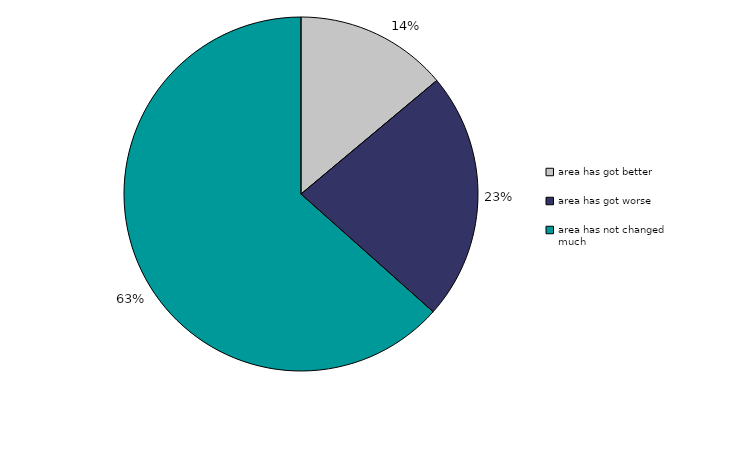
| Category | Series 0 |
|---|---|
| area has got better | 13.915 |
| area has got worse | 22.668 |
| area has not changed much | 63.417 |